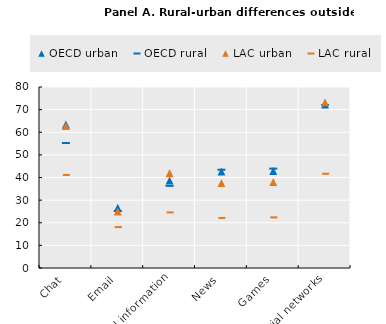
| Category | OECD | LAC |
|---|---|---|
| Chat | 55.259 | 41.141 |
| Email | 25.204 | 18.08 |
| Practical information | 36.301 | 24.57 |
| News | 43.435 | 22.125 |
| Games | 43.932 | 22.368 |
| Social networks | 72.022 | 41.66 |